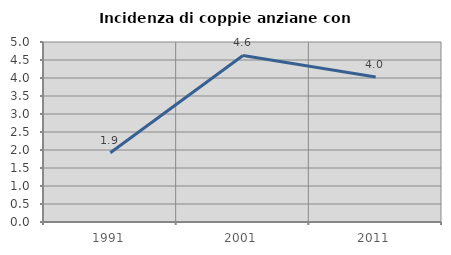
| Category | Incidenza di coppie anziane con figli |
|---|---|
| 1991.0 | 1.923 |
| 2001.0 | 4.626 |
| 2011.0 | 4.025 |